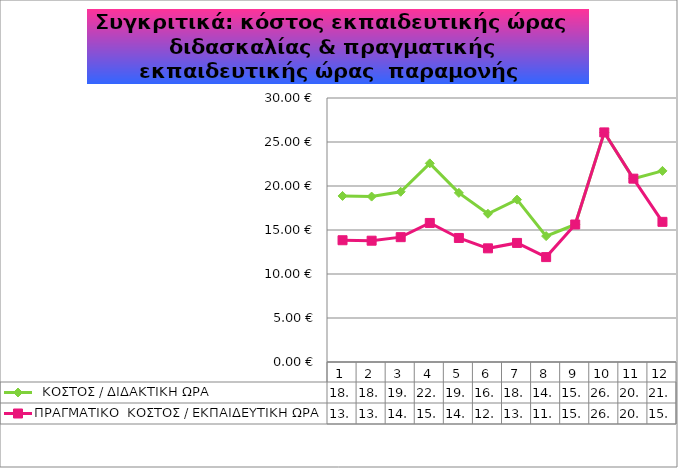
| Category |   ΚΟΣΤΟΣ / ΔΙΔΑΚΤΙΚΗ ΩΡΑ   | ΠΡΑΓΜΑΤΙΚΟ  ΚΟΣΤΟΣ / ΕΚΠΑΙΔΕΥΤΙΚΗ ΩΡΑ |
|---|---|---|
| 0 | 18.868 | 13.837 |
| 1 | 18.797 | 13.784 |
| 2 | 19.345 | 14.186 |
| 3 | 22.575 | 15.802 |
| 4 | 19.22 | 14.095 |
| 5 | 16.848 | 12.916 |
| 6 | 18.452 | 13.532 |
| 7 | 14.304 | 11.92 |
| 8 | 15.625 | 15.625 |
| 9 | 26.089 | 26.089 |
| 10 | 20.834 | 20.834 |
| 11 | 21.718 | 15.926 |